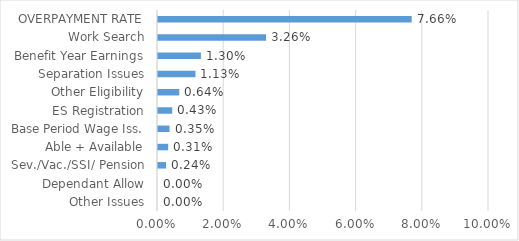
| Category | Series 0 |
|---|---|
| Other Issues | 0 |
| Dependant Allow | 0 |
| Sev./Vac./SSI/ Pension | 0.002 |
| Able + Available | 0.003 |
| Base Period Wage Iss. | 0.003 |
| ES Registration | 0.004 |
| Other Eligibility | 0.006 |
| Separation Issues | 0.011 |
| Benefit Year Earnings | 0.013 |
| Work Search | 0.033 |
| OVERPAYMENT RATE | 0.077 |